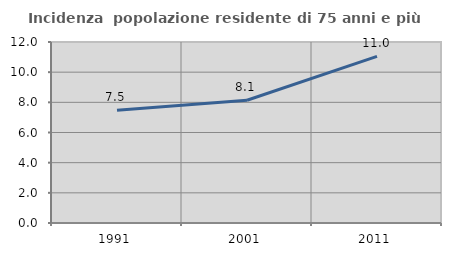
| Category | Incidenza  popolazione residente di 75 anni e più |
|---|---|
| 1991.0 | 7.478 |
| 2001.0 | 8.138 |
| 2011.0 | 11.043 |